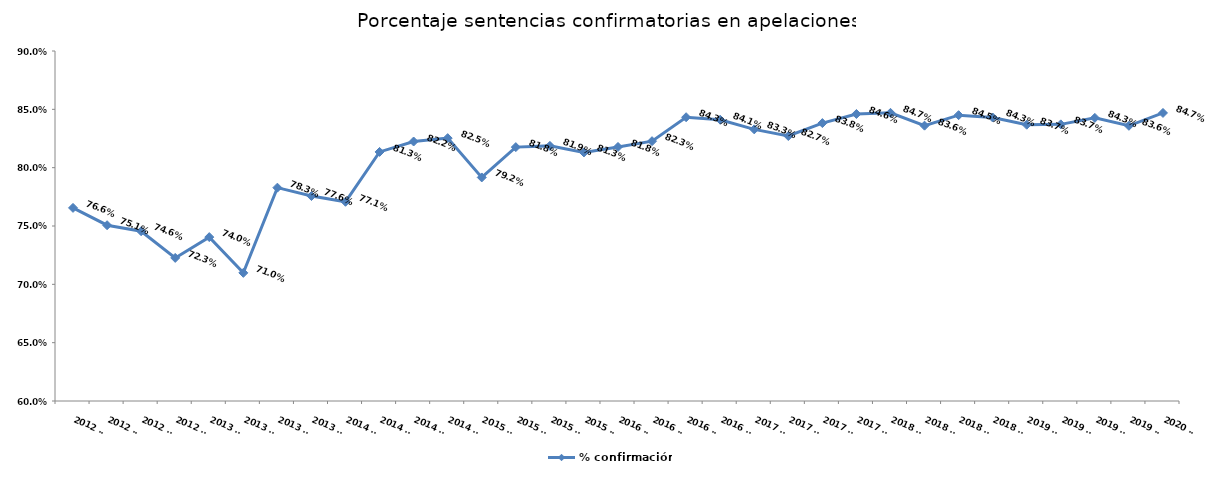
| Category | % confirmación |
|---|---|
| 2012 T1 | 0.766 |
| 2012 T2 | 0.751 |
| 2012 T3 | 0.746 |
| 2012 T4 | 0.723 |
| 2013 T1 | 0.74 |
| 2013 T2 | 0.71 |
| 2013 T3 | 0.783 |
| 2013 T4 | 0.776 |
| 2014 T1 | 0.771 |
| 2014 T2 | 0.813 |
| 2014 T3 | 0.822 |
| 2014 T4 | 0.825 |
| 2015 T1 | 0.792 |
| 2015 T2 | 0.818 |
| 2015 T3 | 0.819 |
| 2015 T4 | 0.813 |
| 2016 T1 | 0.818 |
| 2016 T2 | 0.823 |
| 2016 T3 | 0.843 |
| 2016 T4 | 0.841 |
| 2017 T1 | 0.833 |
| 2017 T2 | 0.827 |
| 2017 T3 | 0.838 |
| 2017 T4 | 0.846 |
| 2018 T1 | 0.847 |
| 2018 T2 | 0.836 |
| 2018 T3 | 0.845 |
| 2018 T4 | 0.843 |
| 2019 T1 | 0.837 |
| 2019 T2 | 0.837 |
| 2019 T3 | 0.843 |
| 2019 T4 | 0.836 |
| 2020 T1 | 0.847 |